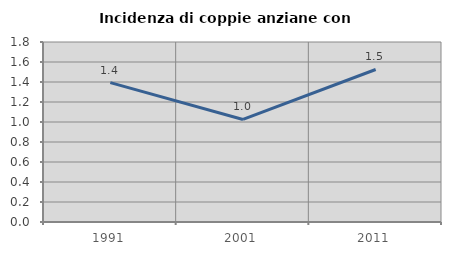
| Category | Incidenza di coppie anziane con figli |
|---|---|
| 1991.0 | 1.394 |
| 2001.0 | 1.026 |
| 2011.0 | 1.525 |